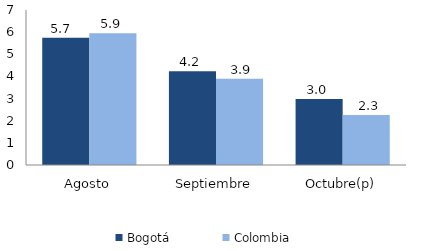
| Category | Bogotá | Colombia |
|---|---|---|
| Agosto | 5.749 | 5.95 |
| Septiembre | 4.234 | 3.895 |
| Octubre(p) | 2.978 | 2.257 |